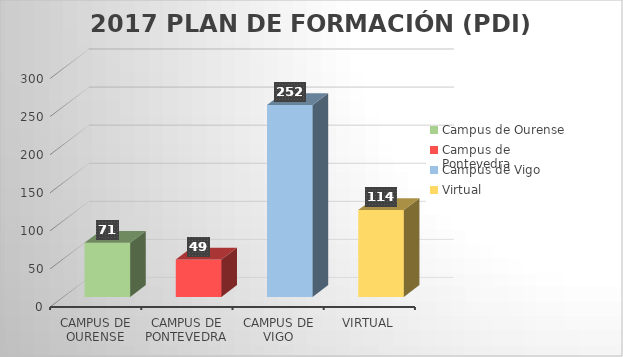
| Category | Asistentes con diploma |
|---|---|
| Campus de Ourense | 71 |
| Campus de Pontevedra | 49 |
| Campus de Vigo | 252 |
| Virtual | 114 |